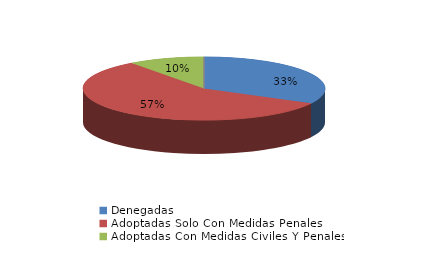
| Category | Series 0 |
|---|---|
| Denegadas | 55 |
| Adoptadas Solo Con Medidas Penales | 96 |
| Adoptadas Con Medidas Civiles Y Penales | 17 |
| Adoptadas Con Medidas Solo Civiles | 0 |